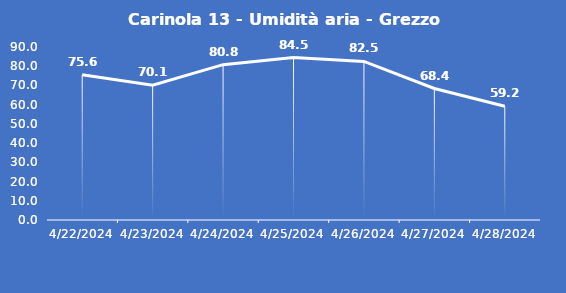
| Category | Carinola 13 - Umidità aria - Grezzo (%) |
|---|---|
| 4/22/24 | 75.6 |
| 4/23/24 | 70.1 |
| 4/24/24 | 80.8 |
| 4/25/24 | 84.5 |
| 4/26/24 | 82.5 |
| 4/27/24 | 68.4 |
| 4/28/24 | 59.2 |